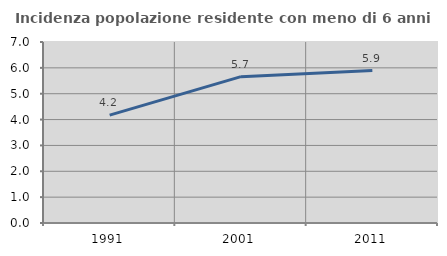
| Category | Incidenza popolazione residente con meno di 6 anni |
|---|---|
| 1991.0 | 4.174 |
| 2001.0 | 5.66 |
| 2011.0 | 5.893 |